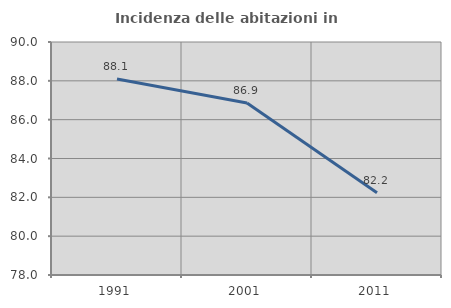
| Category | Incidenza delle abitazioni in proprietà  |
|---|---|
| 1991.0 | 88.095 |
| 2001.0 | 86.857 |
| 2011.0 | 82.234 |